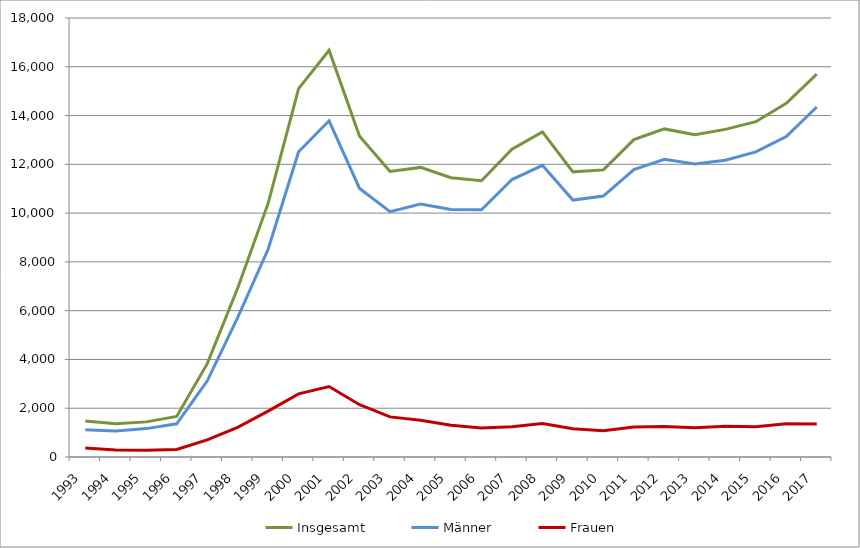
| Category | Insgesamt  | Männer | Frauen |
|---|---|---|---|
| 1993.0 | 1479 | 1113 | 366 |
| 1994.0 | 1359 | 1071 | 288 |
| 1995.0 | 1440 | 1164 | 276 |
| 1996.0 | 1665 | 1359 | 306 |
| 1997.0 | 3816 | 3114 | 702 |
| 1998.0 | 6921 | 5712 | 1212 |
| 1999.0 | 10398 | 8517 | 1881 |
| 2000.0 | 15102 | 12513 | 2589 |
| 2001.0 | 16674 | 13785 | 2889 |
| 2002.0 | 13155 | 11010 | 2142 |
| 2003.0 | 11706 | 10062 | 1644 |
| 2004.0 | 11874 | 10371 | 1503 |
| 2005.0 | 11451 | 10149 | 1302 |
| 2006.0 | 11328 | 10140 | 1188 |
| 2007.0 | 12621 | 11376 | 1245 |
| 2008.0 | 13332 | 11961 | 1371 |
| 2009.0 | 11691 | 10533 | 1158 |
| 2010.0 | 11772 | 10698 | 1074 |
| 2011.0 | 13014 | 11784 | 1230 |
| 2012.0 | 13452 | 12204 | 1248 |
| 2013.0 | 13209 | 12012 | 1197 |
| 2014.0 | 13434 | 12171 | 1263 |
| 2015.0 | 13749 | 12513 | 1236 |
| 2016.0 | 14499 | 13137 | 1362 |
| 2017.0 | 15702 | 14352 | 1350 |